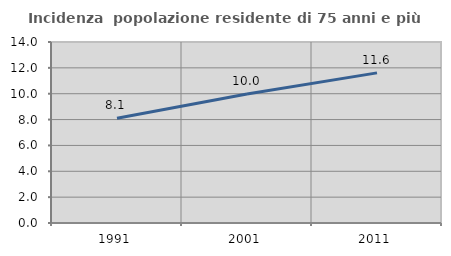
| Category | Incidenza  popolazione residente di 75 anni e più |
|---|---|
| 1991.0 | 8.103 |
| 2001.0 | 9.976 |
| 2011.0 | 11.611 |